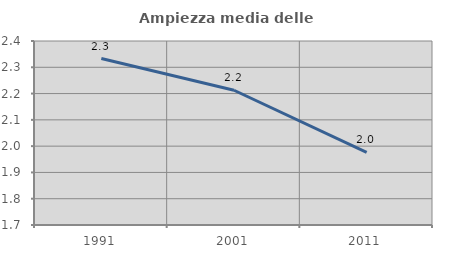
| Category | Ampiezza media delle famiglie |
|---|---|
| 1991.0 | 2.333 |
| 2001.0 | 2.213 |
| 2011.0 | 1.976 |